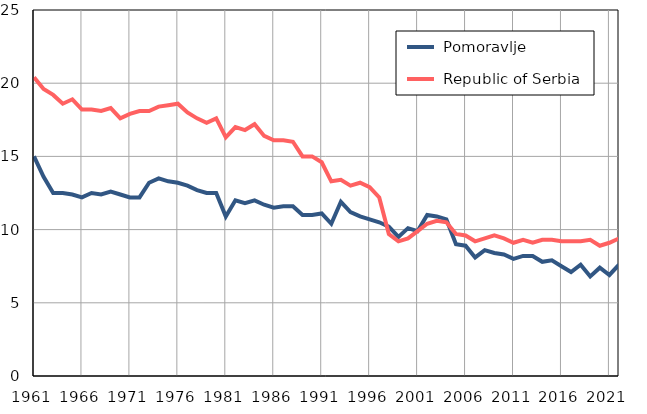
| Category |  Pomoravlje |  Republic of Serbia |
|---|---|---|
| 1961.0 | 15 | 20.4 |
| 1962.0 | 13.6 | 19.6 |
| 1963.0 | 12.5 | 19.2 |
| 1964.0 | 12.5 | 18.6 |
| 1965.0 | 12.4 | 18.9 |
| 1966.0 | 12.2 | 18.2 |
| 1967.0 | 12.5 | 18.2 |
| 1968.0 | 12.4 | 18.1 |
| 1969.0 | 12.6 | 18.3 |
| 1970.0 | 12.4 | 17.6 |
| 1971.0 | 12.2 | 17.9 |
| 1972.0 | 12.2 | 18.1 |
| 1973.0 | 13.2 | 18.1 |
| 1974.0 | 13.5 | 18.4 |
| 1975.0 | 13.3 | 18.5 |
| 1976.0 | 13.2 | 18.6 |
| 1977.0 | 13 | 18 |
| 1978.0 | 12.7 | 17.6 |
| 1979.0 | 12.5 | 17.3 |
| 1980.0 | 12.5 | 17.6 |
| 1981.0 | 10.9 | 16.3 |
| 1982.0 | 12 | 17 |
| 1983.0 | 11.8 | 16.8 |
| 1984.0 | 12 | 17.2 |
| 1985.0 | 11.7 | 16.4 |
| 1986.0 | 11.5 | 16.1 |
| 1987.0 | 11.6 | 16.1 |
| 1988.0 | 11.6 | 16 |
| 1989.0 | 11 | 15 |
| 1990.0 | 11 | 15 |
| 1991.0 | 11.1 | 14.6 |
| 1992.0 | 10.4 | 13.3 |
| 1993.0 | 11.9 | 13.4 |
| 1994.0 | 11.2 | 13 |
| 1995.0 | 10.9 | 13.2 |
| 1996.0 | 10.7 | 12.9 |
| 1997.0 | 10.5 | 12.2 |
| 1998.0 | 10.2 | 9.7 |
| 1999.0 | 9.5 | 9.2 |
| 2000.0 | 10.1 | 9.4 |
| 2001.0 | 9.9 | 9.9 |
| 2002.0 | 11 | 10.4 |
| 2003.0 | 10.9 | 10.6 |
| 2004.0 | 10.7 | 10.5 |
| 2005.0 | 9 | 9.7 |
| 2006.0 | 8.9 | 9.6 |
| 2007.0 | 8.1 | 9.2 |
| 2008.0 | 8.6 | 9.4 |
| 2009.0 | 8.4 | 9.6 |
| 2010.0 | 8.3 | 9.4 |
| 2011.0 | 8 | 9.1 |
| 2012.0 | 8.2 | 9.3 |
| 2013.0 | 8.2 | 9.1 |
| 2014.0 | 7.8 | 9.3 |
| 2015.0 | 7.9 | 9.3 |
| 2016.0 | 7.5 | 9.2 |
| 2017.0 | 7.1 | 9.2 |
| 2018.0 | 7.6 | 9.2 |
| 2019.0 | 6.8 | 9.3 |
| 2020.0 | 7.4 | 8.9 |
| 2021.0 | 6.9 | 9.1 |
| 2022.0 | 7.6 | 9.4 |